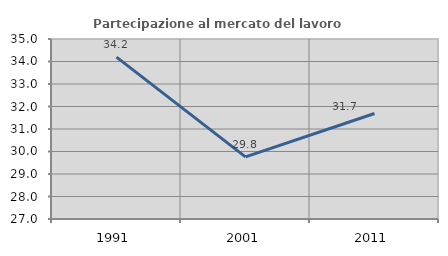
| Category | Partecipazione al mercato del lavoro  femminile |
|---|---|
| 1991.0 | 34.196 |
| 2001.0 | 29.759 |
| 2011.0 | 31.688 |